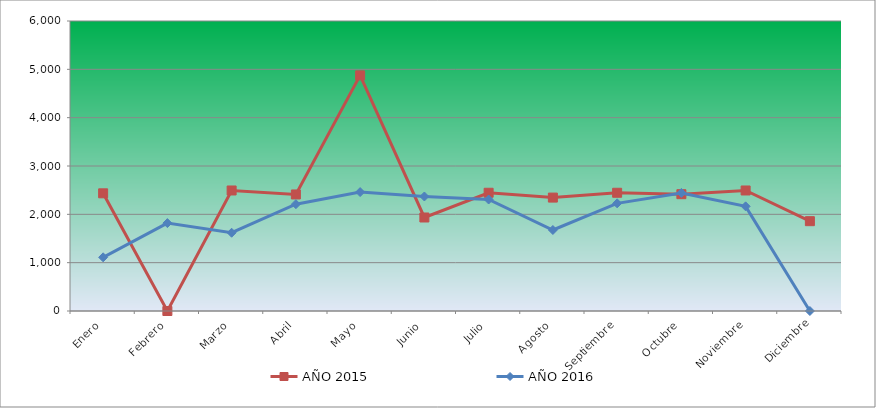
| Category | AÑO 2015 | AÑO 2016 |
|---|---|---|
| Enero | 2434.624 | 1110.764 |
| Febrero | 0 | 1818.131 |
| Marzo | 2493.431 | 1619.273 |
| Abril | 2411.101 | 2210.165 |
| Mayo | 4875.128 | 2460.158 |
| Junio | 1934.761 | 2369.252 |
| Julio | 2446.385 | 2306.754 |
| Agosto | 2346.413 | 1676.089 |
| Septiembre | 2446.385 | 2227.21 |
| Octubre | 2416.982 | 2443.113 |
| Noviembre | 2493.431 | 2164.712 |
| Diciembre | 1858.312 | 0 |